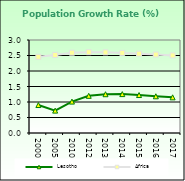
| Category | Lesotho | Africa  |
|---|---|---|
| 2000.0 | 0.902 | 2.458 |
| 2005.0 | 0.722 | 2.516 |
| 2010.0 | 1.014 | 2.59 |
| 2012.0 | 1.199 | 2.606 |
| 2013.0 | 1.251 | 2.601 |
| 2014.0 | 1.255 | 2.584 |
| 2015.0 | 1.224 | 2.559 |
| 2016.0 | 1.184 | 2.531 |
| 2017.0 | 1.15 | 2.503 |